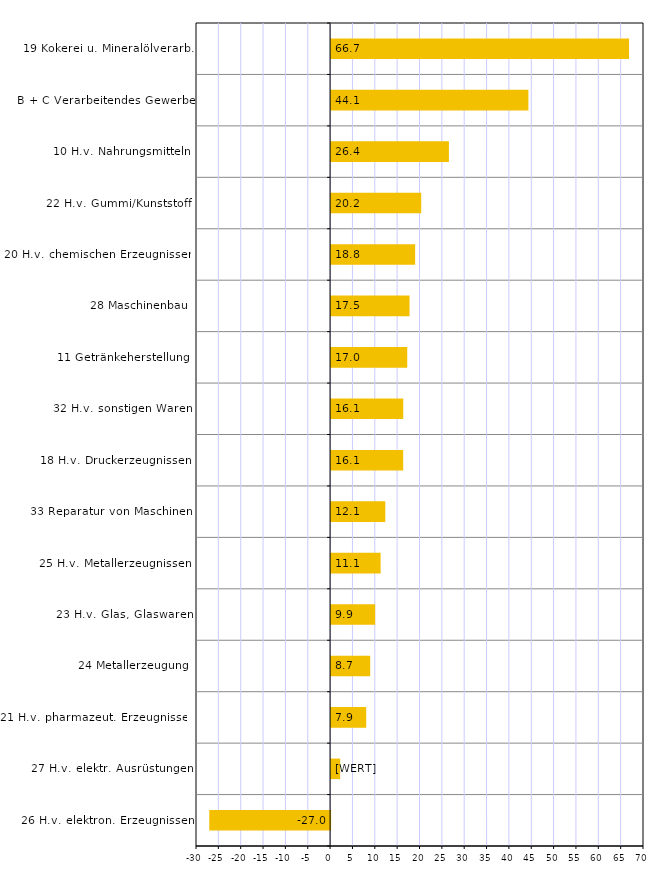
| Category | Series 2 |
|---|---|
| 26 H.v. elektron. Erzeugnissen | -27.031 |
| 27 H.v. elektr. Ausrüstungen | 2.031 |
| 21 H.v. pharmazeut. Erzeugnissen | 7.853 |
| 24 Metallerzeugung | 8.745 |
| 23 H.v. Glas, Glaswaren | 9.853 |
| 25 H.v. Metallerzeugnissen | 11.079 |
| 33 Reparatur von Maschinen | 12.123 |
| 18 H.v. Druckerzeugnissen | 16.122 |
| 32 H.v. sonstigen Waren | 16.136 |
| 11 Getränkeherstellung | 17.032 |
| 28 Maschinenbau | 17.549 |
| 20 H.v. chemischen Erzeugnissen | 18.802 |
| 22 H.v. Gummi/Kunststoff | 20.161 |
| 10 H.v. Nahrungsmitteln | 26.359 |
| B + C Verarbeitendes Gewerbe | 44.138 |
| 19 Kokerei u. Mineralölverarb. | 66.661 |